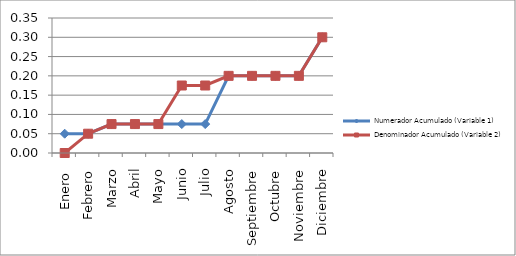
| Category | Numerador Acumulado (Variable 1) | Denominador Acumulado (Variable 2) |
|---|---|---|
| Enero  | 0.05 | 0 |
| Febrero | 0.05 | 0.05 |
| Marzo | 0.075 | 0.075 |
| Abril | 0.075 | 0.075 |
| Mayo | 0.075 | 0.075 |
| Junio | 0.075 | 0.175 |
| Julio | 0.075 | 0.175 |
| Agosto | 0.2 | 0.2 |
| Septiembre | 0.2 | 0.2 |
| Octubre | 0.2 | 0.2 |
| Noviembre | 0.2 | 0.2 |
| Diciembre | 0.3 | 0.3 |